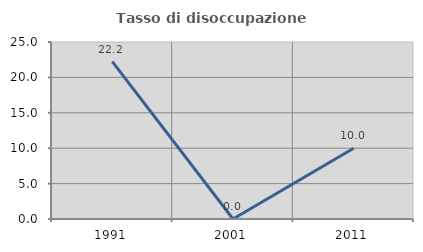
| Category | Tasso di disoccupazione giovanile  |
|---|---|
| 1991.0 | 22.222 |
| 2001.0 | 0 |
| 2011.0 | 10 |